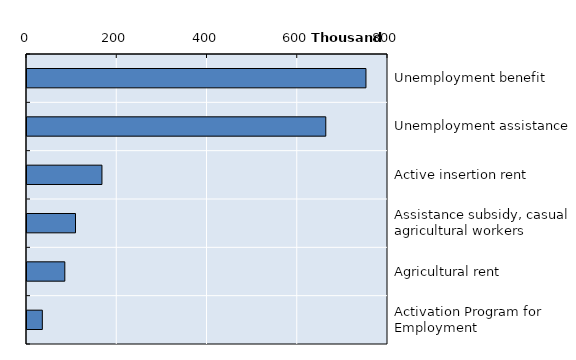
| Category | Series 0 |
|---|---|
| Unemployment benefit | 751171.667 |
| Unemployment assistance | 662138.417 |
| Active insertion rent | 166082.167 |
| Assistance subsidy, casual agricultural workers | 107499.667 |
| Agricultural rent | 83798.417 |
| Activation Program for Employment | 33977.833 |